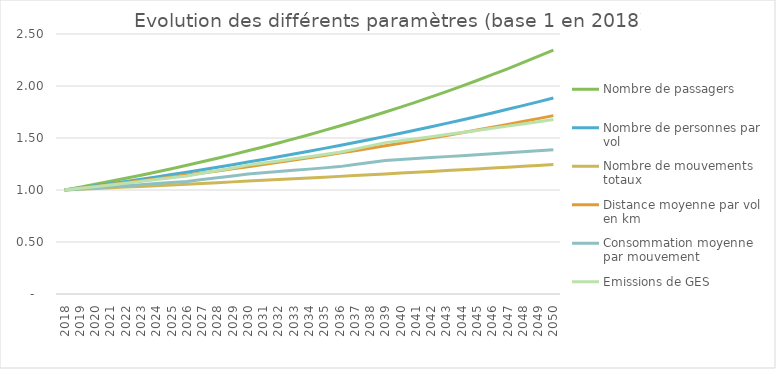
| Category | Nombre de passagers | Nombre de personnes par vol | Nombre de mouvements totaux | Distance moyenne par vol en km | Consommation moyenne par mouvement  | Emissions de GES |
|---|---|---|---|---|---|---|
| 2018.0 | 1 | 1 | 1 | 1 | 1 | 1 |
| 2019.0 | 1.027 | 1.02 | 1.007 | 1.017 | 1.01 | 1.016 |
| 2020.0 | 1.055 | 1.04 | 1.014 | 1.034 | 1.02 | 1.032 |
| 2021.0 | 1.083 | 1.061 | 1.021 | 1.052 | 1.03 | 1.049 |
| 2022.0 | 1.112 | 1.082 | 1.028 | 1.07 | 1.041 | 1.066 |
| 2023.0 | 1.142 | 1.104 | 1.035 | 1.088 | 1.051 | 1.083 |
| 2024.0 | 1.173 | 1.126 | 1.042 | 1.106 | 1.062 | 1.1 |
| 2025.0 | 1.205 | 1.149 | 1.049 | 1.125 | 1.072 | 1.118 |
| 2026.0 | 1.238 | 1.172 | 1.056 | 1.144 | 1.083 | 1.136 |
| 2027.0 | 1.271 | 1.195 | 1.063 | 1.164 | 1.1 | 1.161 |
| 2028.0 | 1.305 | 1.219 | 1.071 | 1.184 | 1.118 | 1.186 |
| 2029.0 | 1.341 | 1.243 | 1.078 | 1.204 | 1.136 | 1.212 |
| 2030.0 | 1.377 | 1.268 | 1.086 | 1.224 | 1.154 | 1.239 |
| 2031.0 | 1.414 | 1.294 | 1.093 | 1.245 | 1.165 | 1.259 |
| 2032.0 | 1.452 | 1.319 | 1.1 | 1.266 | 1.177 | 1.279 |
| 2033.0 | 1.491 | 1.346 | 1.108 | 1.288 | 1.189 | 1.3 |
| 2034.0 | 1.532 | 1.373 | 1.116 | 1.31 | 1.201 | 1.321 |
| 2035.0 | 1.573 | 1.4 | 1.123 | 1.332 | 1.213 | 1.342 |
| 2036.0 | 1.615 | 1.428 | 1.131 | 1.354 | 1.225 | 1.363 |
| 2037.0 | 1.659 | 1.457 | 1.139 | 1.378 | 1.244 | 1.393 |
| 2038.0 | 1.704 | 1.486 | 1.147 | 1.401 | 1.264 | 1.424 |
| 2039.0 | 1.75 | 1.516 | 1.154 | 1.425 | 1.285 | 1.455 |
| 2040.0 | 1.797 | 1.546 | 1.162 | 1.449 | 1.294 | 1.474 |
| 2041.0 | 1.846 | 1.577 | 1.17 | 1.474 | 1.303 | 1.494 |
| 2042.0 | 1.895 | 1.608 | 1.178 | 1.499 | 1.312 | 1.513 |
| 2043.0 | 1.947 | 1.641 | 1.186 | 1.524 | 1.321 | 1.533 |
| 2044.0 | 1.999 | 1.673 | 1.195 | 1.55 | 1.33 | 1.553 |
| 2045.0 | 2.053 | 1.707 | 1.203 | 1.576 | 1.339 | 1.573 |
| 2046.0 | 2.108 | 1.741 | 1.211 | 1.603 | 1.349 | 1.593 |
| 2047.0 | 2.165 | 1.776 | 1.219 | 1.63 | 1.358 | 1.614 |
| 2048.0 | 2.224 | 1.811 | 1.228 | 1.658 | 1.368 | 1.635 |
| 2049.0 | 2.284 | 1.848 | 1.236 | 1.686 | 1.377 | 1.657 |
| 2050.0 | 2.346 | 1.885 | 1.245 | 1.715 | 1.387 | 1.678 |